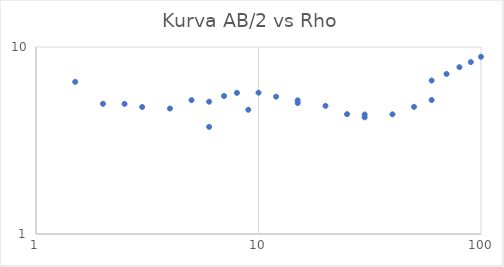
| Category | Series 0 |
|---|---|
| 1.5 | 6.51 |
| 2.0 | 4.968 |
| 2.5 | 4.964 |
| 3.0 | 4.777 |
| 4.0 | 4.687 |
| 5.0 | 5.196 |
| 6.0 | 3.74 |
| 6.0 | 5.099 |
| 7.0 | 5.47 |
| 8.0 | 5.687 |
| 9.0 | 4.617 |
| 10.0 | 5.697 |
| 12.0 | 5.424 |
| 15.0 | 5.016 |
| 15.0 | 5.187 |
| 20.0 | 4.844 |
| 25.0 | 4.375 |
| 30.0 | 4.205 |
| 30.0 | 4.356 |
| 40.0 | 4.365 |
| 50.0 | 4.786 |
| 60.0 | 5.202 |
| 60.0 | 6.618 |
| 70.0 | 7.174 |
| 80.0 | 7.797 |
| 90.0 | 8.307 |
| 100.0 | 8.863 |